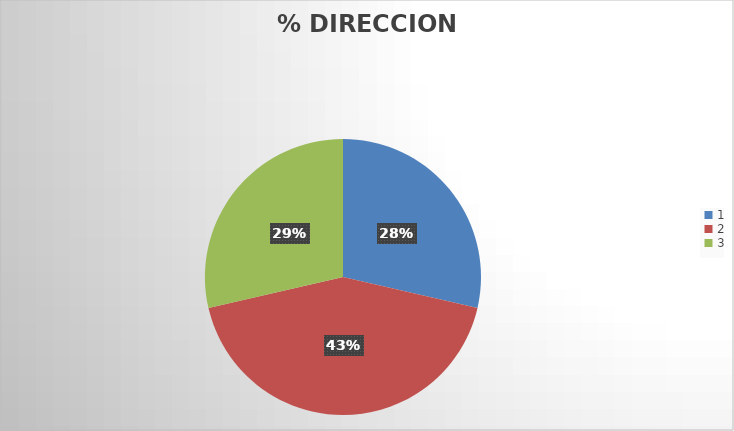
| Category | Series 0 |
|---|---|
| 0 | 0.286 |
| 1 | 0.428 |
| 2 | 0.286 |